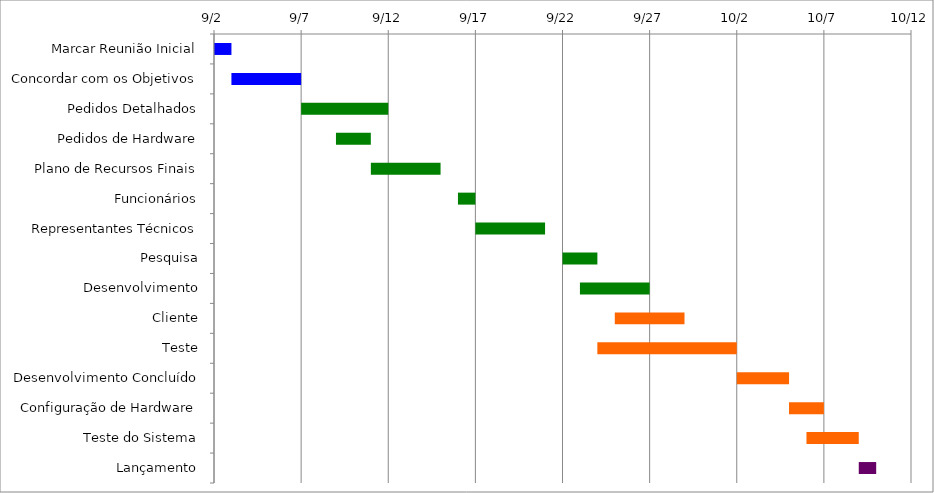
| Category | Início | Dias |
|---|---|---|
| Marcar Reunião Inicial | 2015-09-02 | 1 |
| Concordar com os Objetivos | 2015-09-03 | 4 |
| Pedidos Detalhados | 2015-09-07 | 5 |
| Pedidos de Hardware | 2015-09-09 | 2 |
| Plano de Recursos Finais | 2015-09-11 | 4 |
| Funcionários | 2015-09-16 | 1 |
| Representantes Técnicos | 2015-09-17 | 4 |
| Pesquisa | 2015-09-22 | 2 |
| Desenvolvimento | 2015-09-23 | 4 |
| Cliente | 2015-09-25 | 4 |
| Teste | 2015-09-24 | 8 |
| Desenvolvimento Concluído | 2015-10-02 | 3 |
| Configuração de Hardware | 2015-10-05 | 2 |
| Teste do Sistema | 2015-10-06 | 3 |
| Lançamento | 2015-10-09 | 1 |